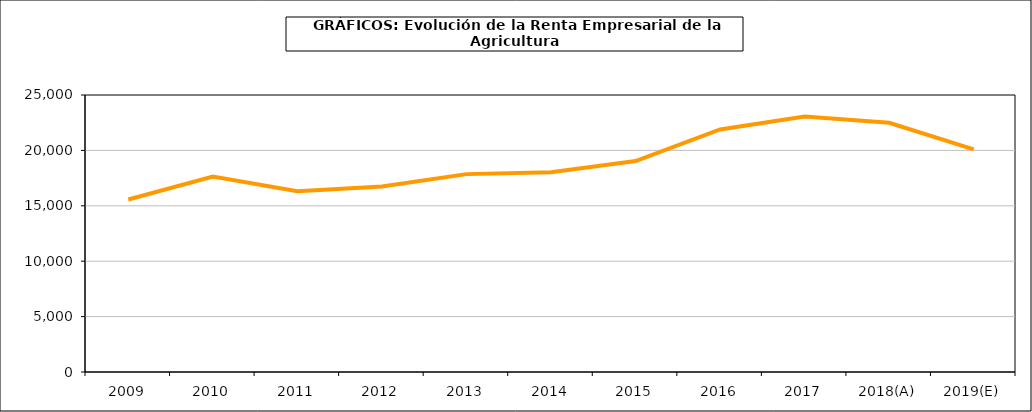
| Category | renta empresarial |
|---|---|
| 2009 | 15568.835 |
| 2010 | 17633.246 |
| 2011 | 16322.948 |
| 2012 | 16739.148 |
| 2013 | 17858.951 |
| 2014 | 18029.917 |
| 2015 | 19041.49 |
| 2016 | 21888.067 |
| 2017 | 23056.94 |
| 2018(A) | 22493.774 |
| 2019(E) | 20088.101 |